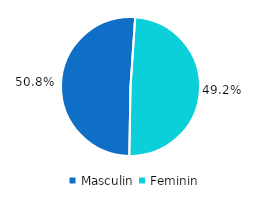
| Category | Series 0 |
|---|---|
| Masculin | 50.8 |
| Feminin | 49.2 |